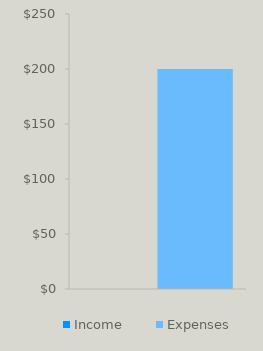
| Category | Income | Expenses |
|---|---|---|
| 0 | 0 | 200 |